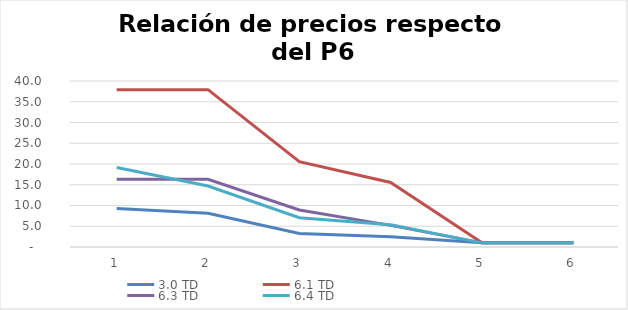
| Category | 3.0 TD | 6.1 TD | 6.3 TD | 6.4 TD |
|---|---|---|---|---|
| 0 | 9.296 | 37.92 | 16.303 | 19.176 |
| 1 | 8.123 | 37.92 | 16.303 | 14.697 |
| 2 | 3.275 | 20.581 | 8.923 | 7.069 |
| 3 | 2.49 | 15.557 | 5.216 | 5.362 |
| 4 | 1 | 1 | 1 | 1 |
| 5 | 1 | 1 | 1 | 1 |